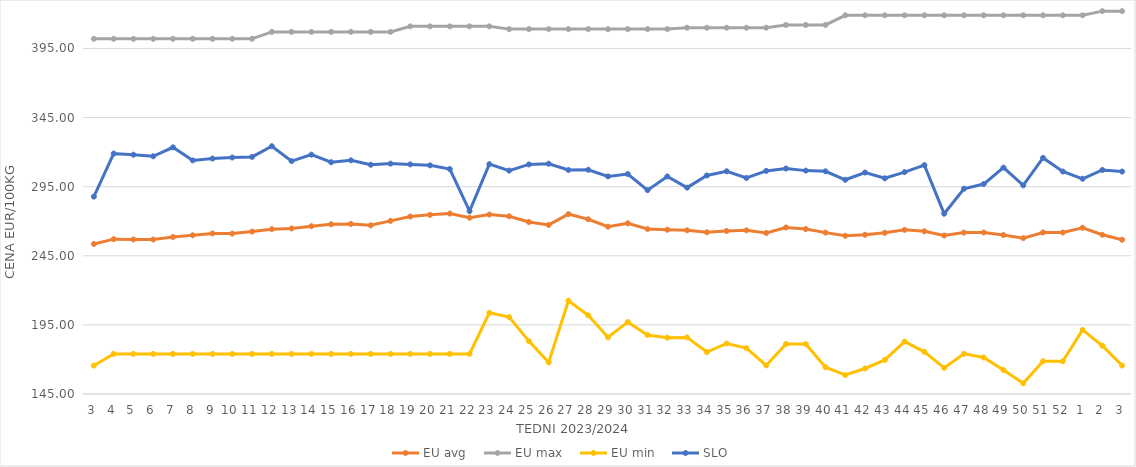
| Category | EU avg | EU max | EU min | SLO |
|---|---|---|---|---|
| 3.0 | 253.546 | 402 | 165.574 | 287.81 |
| 4.0 | 257.051 | 402 | 174 | 318.98 |
| 5.0 | 256.808 | 402 | 174 | 318.13 |
| 6.0 | 256.75 | 402 | 174 | 316.99 |
| 7.0 | 258.565 | 402 | 174 | 323.47 |
| 8.0 | 259.872 | 402 | 174 | 314 |
| 9.0 | 261.164 | 402 | 174 | 315.35 |
| 10.0 | 261.06 | 402 | 174 | 316.13 |
| 11.0 | 262.513 | 402 | 174 | 316.55 |
| 12.0 | 264.228 | 407 | 174 | 324.27 |
| 13.0 | 264.768 | 407 | 174 | 313.49 |
| 14.0 | 266.385 | 407 | 174 | 318.17 |
| 15.0 | 267.797 | 407 | 174 | 312.7 |
| 16.0 | 268.021 | 407 | 174 | 314.07 |
| 17.0 | 267.041 | 407 | 174 | 310.87 |
| 18.0 | 270.255 | 407 | 174 | 311.69 |
| 19.0 | 273.406 | 411 | 174 | 311.13 |
| 20.0 | 274.631 | 411 | 174 | 310.42 |
| 21.0 | 275.561 | 411 | 174 | 307.76 |
| 22.0 | 272.542 | 411 | 174 | 277.34 |
| 23.0 | 274.85 | 411 | 203.728 | 311.28 |
| 24.0 | 273.59 | 409 | 200.686 | 306.64 |
| 25.0 | 269.439 | 409 | 183.275 | 311.1 |
| 26.0 | 267.345 | 409 | 167.858 | 311.62 |
| 27.0 | 275.123 | 409 | 212.506 | 307.04 |
| 28.0 | 271.42 | 409 | 201.945 | 307.23 |
| 29.0 | 266.08 | 409 | 186.018 | 302.45 |
| 30.0 | 268.49 | 409 | 197.093 | 304.14 |
| 31.0 | 264.334 | 409 | 187.684 | 292.49 |
| 32.0 | 263.844 | 409 | 185.774 | 302.41 |
| 33.0 | 263.441 | 410 | 185.951 | 294.3 |
| 34.0 | 262.028 | 410 | 175.332 | 303.1 |
| 35.0 | 262.997 | 410 | 181.543 | 306.13 |
| 36.0 | 263.389 | 410 | 178.207 | 301.32 |
| 37.0 | 261.486 | 410 | 165.697 | 306.4 |
| 38.0 | 265.47 | 412 | 181.159 | 308.12 |
| 39.0 | 264.316 | 412 | 181.124 | 306.62 |
| 40.0 | 261.774 | 412 | 164.37 | 306.1 |
| 41.0 | 259.456 | 419 | 158.728 | 300 |
| 42.0 | 260.21 | 419 | 163.464 | 305.24 |
| 43.0 | 261.605 | 419 | 169.66 | 301.07 |
| 44.0 | 263.758 | 419 | 182.925 | 305.52 |
| 45.0 | 262.714 | 419 | 175.524 | 310.58 |
| 46.0 | 259.625 | 419 | 163.882 | 275.46 |
| 47.0 | 261.772 | 419 | 174.136 | 293.51 |
| 48.0 | 261.864 | 419 | 171.4 | 296.9 |
| 49.0 | 260.014 | 419 | 162.336 | 308.8 |
| 50.0 | 257.768 | 419 | 152.762 | 295.97 |
| 51.0 | 261.869 | 419 | 168.739 | 315.82 |
| 52.0 | 261.805 | 419 | 168.659 | 305.97 |
| 1.0 | 265.269 | 419 | 191.406 | 300.71 |
| 2.0 | 260.192 | 422 | 179.926 | 307.09 |
| 3.0 | 256.616 | 422 | 165.575 | 305.92 |